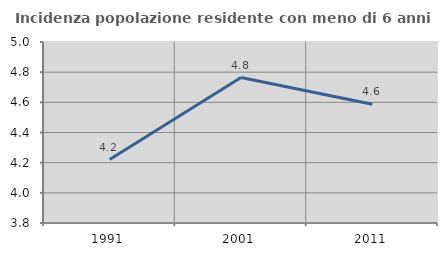
| Category | Incidenza popolazione residente con meno di 6 anni |
|---|---|
| 1991.0 | 4.221 |
| 2001.0 | 4.764 |
| 2011.0 | 4.587 |